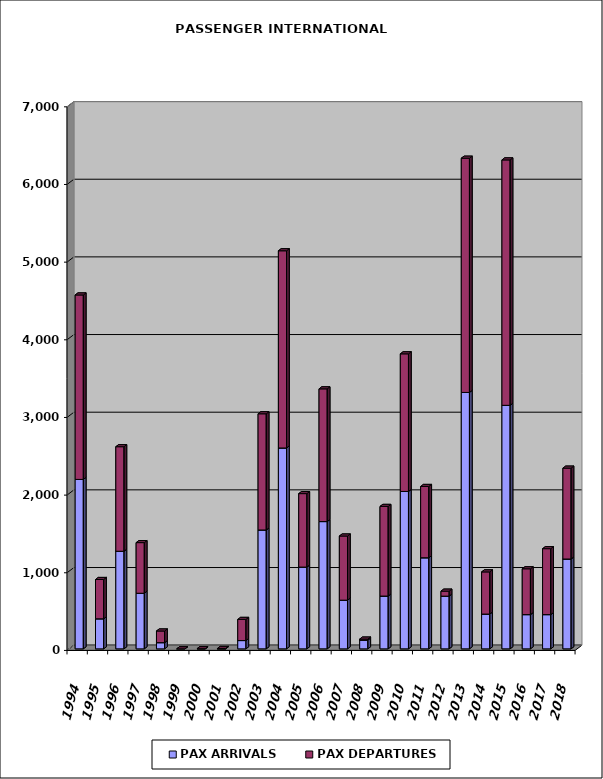
| Category | PAX ARRIVALS | PAX DEPARTURES |
|---|---|---|
| 1994.0 | 2182 | 2375 |
| 1995.0 | 387 | 506 |
| 1996.0 | 1257 | 1346 |
| 1997.0 | 716 | 652 |
| 1998.0 | 80 | 150 |
| 1999.0 | 0 | 0 |
| 2000.0 | 2 | 0 |
| 2001.0 | 0 | 5 |
| 2002.0 | 107 | 272 |
| 2003.0 | 1531 | 1496 |
| 2004.0 | 2587 | 2539 |
| 2005.0 | 1053 | 946 |
| 2006.0 | 1639 | 1709 |
| 2007.0 | 627 | 826 |
| 2008.0 | 113 | 13 |
| 2009.0 | 680 | 1154 |
| 2010.0 | 2027 | 1772 |
| 2011.0 | 1173 | 918 |
| 2012.0 | 679 | 64 |
| 2013.0 | 3302 | 3016 |
| 2014.0 | 448 | 543 |
| 2015.0 | 3136 | 3160 |
| 2016.0 | 441 | 590 |
| 2017.0 | 441 | 849 |
| 2018.0 | 1157 | 1170 |